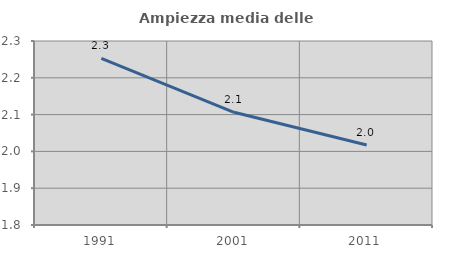
| Category | Ampiezza media delle famiglie |
|---|---|
| 1991.0 | 2.253 |
| 2001.0 | 2.106 |
| 2011.0 | 2.017 |